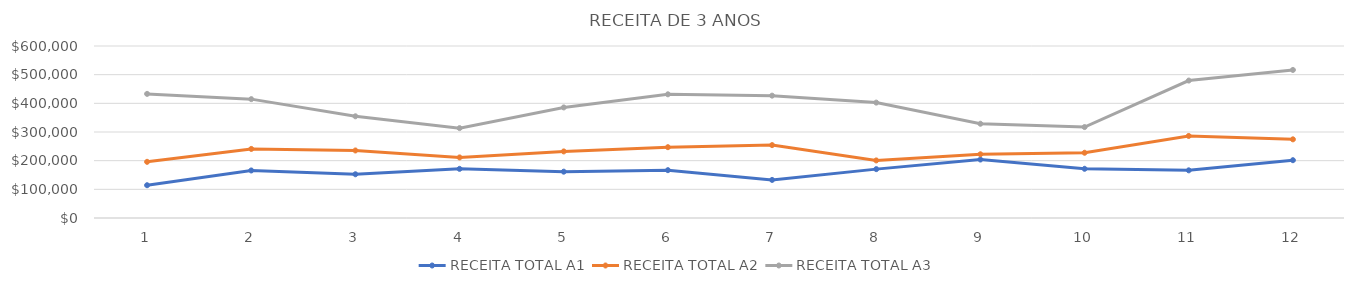
| Category | RECEITA TOTAL A1 | RECEITA TOTAL A2 | RECEITA TOTAL A3 |
|---|---|---|---|
| 0 | 114350 | 195956 | 432976 |
| 1 | 165800 | 240945 | 414652 |
| 2 | 152557 | 235555 | 354787 |
| 3 | 171421 | 211305 | 313504 |
| 4 | 161618 | 232213 | 385676 |
| 5 | 166870 | 247021 | 431520 |
| 6 | 132884 | 254266 | 426803 |
| 7 | 170481 | 200836 | 402533 |
| 8 | 203968 | 222280 | 328813 |
| 9 | 171681 | 227616 | 317269 |
| 10 | 166247 | 286221 | 479413 |
| 11 | 201651 | 274416 | 516463 |